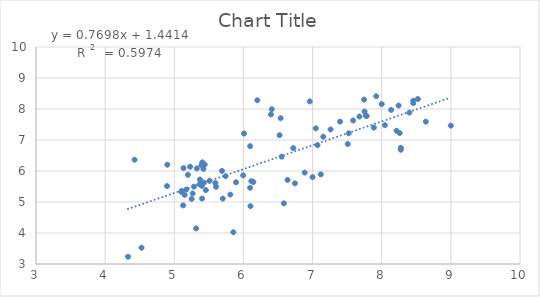
| Category | Series 0 |
|---|---|
| 8.638 | 7.591 |
| 6.959 | 8.245 |
| 6.538 | 7.703 |
| 6.201 | 8.282 |
| 5.456 | 5.385 |
| 5.229 | 6.138 |
| 8.276 | 6.748 |
| 7.26 | 7.34 |
| 6.721 | 6.739 |
| 5.509 | 5.683 |
| 4.331 | 3.234 |
| 7.119 | 5.891 |
| 4.526 | 3.525 |
| 5.854 | 4.026 |
| 5.252 | 5.099 |
| 4.425 | 6.363 |
| 8.215 | 7.297 |
| 8.137 | 7.97 |
| 6.585 | 4.957 |
| 8.276 | 6.685 |
| 7.509 | 6.871 |
| 7.587 | 7.629 |
| 7.752 | 7.917 |
| 6.398 | 7.823 |
| 7.398 | 7.593 |
| 7.783 | 7.773 |
| 7.77 | 7.783 |
| 8.4 | 7.884 |
| 5.102 | 5.326 |
| 6.41 | 7.992 |
| 8.523 | 8.323 |
| 8.456 | 8.188 |
| 7.071 | 6.834 |
| 8.26 | 7.223 |
| 8.0 | 8.158 |
| 7.921 | 8.411 |
| 9.0 | 7.462 |
| 8.456 | 8.266 |
| 8.046 | 7.478 |
| 7.745 | 8.302 |
| 6.523 | 7.156 |
| 7.155 | 7.107 |
| 7.886 | 7.401 |
| 7.678 | 7.757 |
| 7.523 | 7.217 |
| 8.244 | 8.112 |
| 5.69 | 6.002 |
| 5.421 | 6.066 |
| 5.595 | 5.611 |
| 5.604 | 5.49 |
| 5.371 | 5.725 |
| 5.393 | 6.19 |
| 5.106 | 5.355 |
| 5.133 | 6.094 |
| 5.366 | 5.573 |
| 5.398 | 5.521 |
| 5.197 | 5.876 |
| 6.009 | 7.208 |
| 5.15 | 5.228 |
| 5.406 | 6.28 |
| 5.326 | 6.084 |
| 4.899 | 6.202 |
| 5.742 | 5.833 |
| 6.745 | 5.602 |
| 6.886 | 5.949 |
| 6.638 | 5.712 |
| 5.174 | 5.403 |
| 4.895 | 5.513 |
| 5.81 | 5.239 |
| 6.097 | 5.459 |
| 5.265 | 5.277 |
| 5.701 | 5.111 |
| 5.402 | 5.111 |
| 5.429 | 5.627 |
| 6.097 | 6.8 |
| 5.996 | 5.86 |
| 6.553 | 6.463 |
| 6.114 | 5.673 |
| 7.046 | 7.375 |
| 5.893 | 5.635 |
| 5.284 | 5.495 |
| 5.316 | 4.149 |
| 5.128 | 4.891 |
| 6.102 | 4.865 |
| 6.143 | 5.645 |
| 5.44 | 6.208 |
| 7.0 | 5.801 |